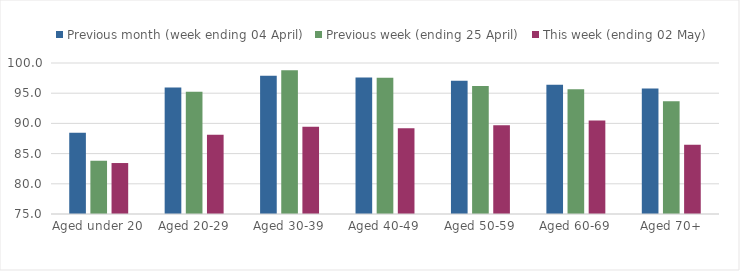
| Category | Previous month (week ending 04 April) | Previous week (ending 25 April) | This week (ending 02 May) |
|---|---|---|---|
| Aged under 20 | 88.461 | 83.823 | 83.439 |
| Aged 20-29 | 95.928 | 95.248 | 88.102 |
| Aged 30-39 | 97.892 | 98.79 | 89.455 |
| Aged 40-49 | 97.615 | 97.578 | 89.193 |
| Aged 50-59 | 97.071 | 96.194 | 89.682 |
| Aged 60-69 | 96.391 | 95.669 | 90.492 |
| Aged 70+ | 95.787 | 93.675 | 86.466 |